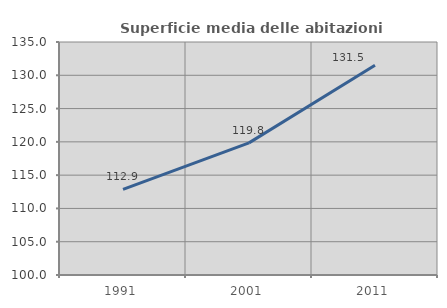
| Category | Superficie media delle abitazioni occupate |
|---|---|
| 1991.0 | 112.85 |
| 2001.0 | 119.849 |
| 2011.0 | 131.504 |